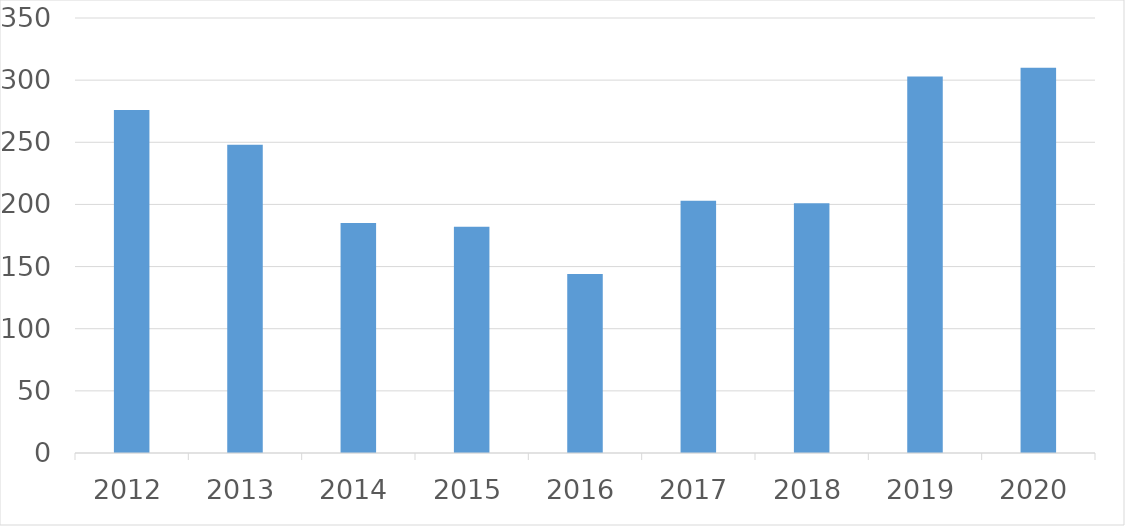
| Category | Series 0 |
|---|---|
| 2012 | 276 |
| 2013 | 248 |
| 2014 | 185 |
| 2015 | 182 |
| 2016 | 144 |
| 2017 | 203 |
| 2018 | 201 |
| 2019 | 303 |
| 2020 | 310 |